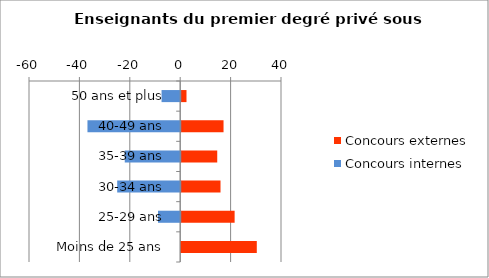
| Category | Concours externes | Concours internes |
|---|---|---|
| 50 ans et plus | 2.1 | -7.4 |
| 40-49 ans | 16.8 | -36.8 |
| 35-39 ans | 14.3 | -22 |
| 30-34 ans | 15.6 | -25 |
| 25-29 ans | 21.2 | -8.8 |
| Moins de 25 ans | 30 | 0 |